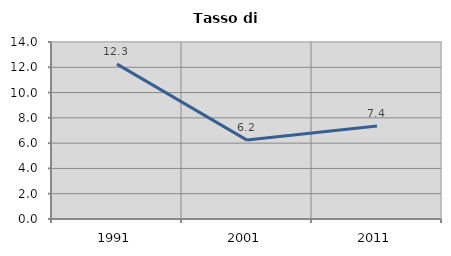
| Category | Tasso di disoccupazione   |
|---|---|
| 1991.0 | 12.252 |
| 2001.0 | 6.241 |
| 2011.0 | 7.351 |